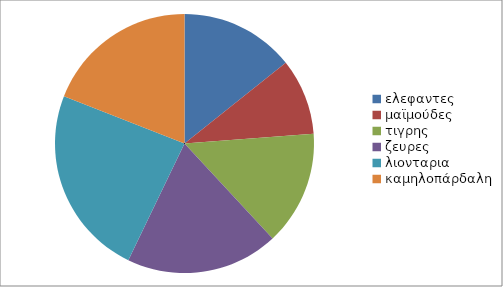
| Category | Series 0 |
|---|---|
| ελεφαντες | 3 |
| μαϊμούδες | 2 |
| τιγρης | 3 |
| ζευρες | 4 |
| λιονταρια | 5 |
| καμηλοπάρδαλη | 4 |